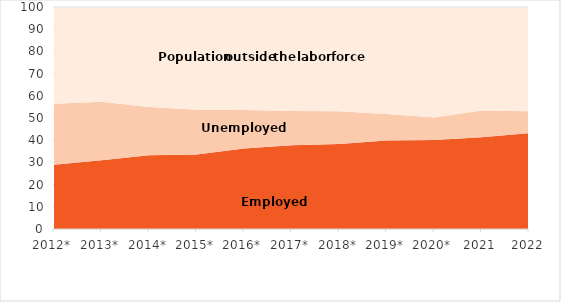
| Category | Employed | Unemployed | Population outside the labour force |
|---|---|---|---|
| 2012* | 28.933 | 27.449 | 60.121 |
| 2013* | 31.02 | 26.254 | 57.937 |
| 2014* | 33.188 | 21.789 | 57.566 |
| 2015* | 33.569 | 20.14 | 57.965 |
| 2016* | 36.251 | 17.321 | 56.155 |
| 2017* | 37.733 | 15.385 | 55.407 |
| 2018* | 38.335 | 14.745 | 55.035 |
| 2019* | 39.834 | 11.956 | 54.756 |
| 2020* | 40.069 | 10.188 | 55.385 |
| 2021 | 41.345 | 12.066 | 52.981 |
| 2022 | 43.2 | 9.8 | 52.1 |